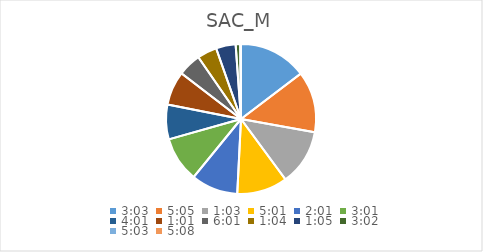
| Category | Series 0 |
|---|---|
| 0.12708333333333333 | 11.745 |
| 0.21180555555555555 | 10.544 |
| 0.043750000000000004 | 9.66 |
| 0.20902777777777778 | 8.719 |
| 0.08402777777777777 | 8.076 |
| 0.12569444444444444 | 7.793 |
| 0.1673611111111111 | 5.988 |
| 0.042361111111111106 | 5.852 |
| 0.25069444444444444 | 3.98 |
| 0.044444444444444446 | 3.392 |
| 0.04513888888888889 | 3.392 |
| 0.12638888888888888 | 0.796 |
| 0.21041666666666667 | 0.061 |
| 0.2138888888888889 | 0.061 |